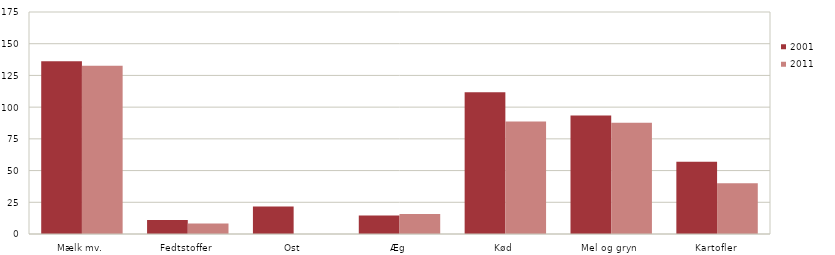
| Category | 2001 | 2011 |
|---|---|---|
| Mælk mv. | 136.2 | 132.7 |
| Fedtstoffer | 11.1 | 8.3 |
| Ost | 21.7 | 0 |
| Æg | 14.5 | 15.7 |
| Kød | 111.7 | 88.7 |
| Mel og gryn | 93.4 | 87.6 |
| Kartofler | 56.9 | 40 |